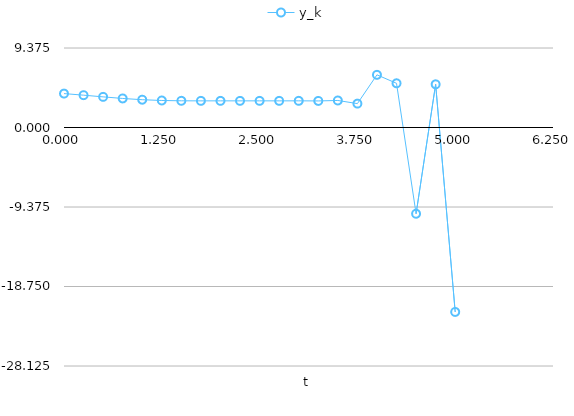
| Category | y_k |
|---|---|
| 0.0 | 4 |
| 0.25 | 3.811 |
| 0.5 | 3.612 |
| 0.75 | 3.425 |
| 1.0 | 3.277 |
| 1.25 | 3.185 |
| 1.5 | 3.147 |
| 1.75 | 3.141 |
| 2.0 | 3.142 |
| 2.25 | 3.141 |
| 2.5 | 3.142 |
| 2.75 | 3.141 |
| 3.0 | 3.144 |
| 3.25 | 3.133 |
| 3.5 | 3.186 |
| 3.75 | 2.817 |
| 4.0 | 6.21 |
| 4.25 | 5.212 |
| 4.5 | -10.17 |
| 4.75 | 5.092 |
| 5.0 | -21.75 |